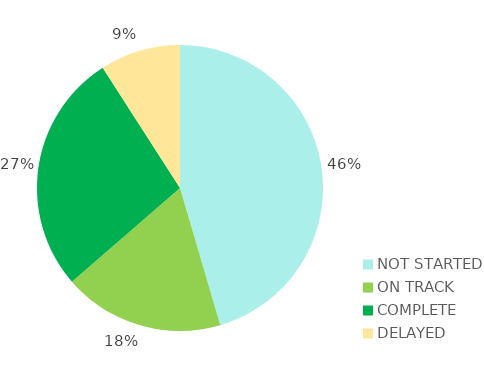
| Category | Series 0 |
|---|---|
| NOT STARTED | 5 |
| ON TRACK | 2 |
| COMPLETE | 3 |
| DELAYED | 1 |